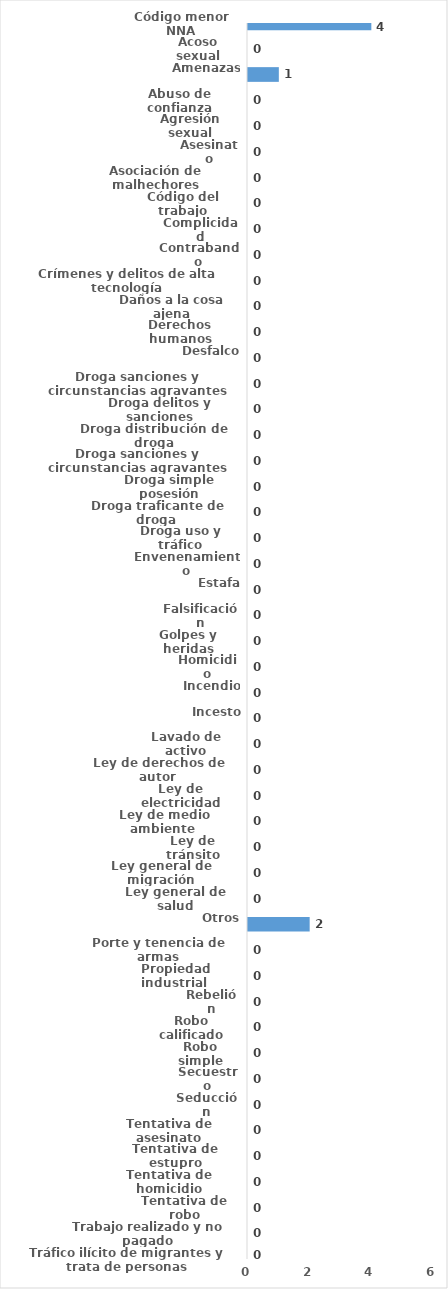
| Category | Series 0 |
|---|---|
| Código menor NNA | 4 |
| Acoso sexual | 0 |
| Amenazas | 1 |
| Abuso de confianza | 0 |
| Agresión sexual | 0 |
| Asesinato | 0 |
| Asociación de malhechores | 0 |
| Código del trabajo | 0 |
| Complicidad | 0 |
| Contrabando | 0 |
| Crímenes y delitos de alta tecnología | 0 |
| Daños a la cosa ajena | 0 |
| Derechos humanos | 0 |
| Desfalco | 0 |
| Droga sanciones y circunstancias agravantes | 0 |
| Droga delitos y sanciones | 0 |
| Droga distribución de droga | 0 |
| Droga sanciones y circunstancias agravantes | 0 |
| Droga simple posesión | 0 |
| Droga traficante de droga  | 0 |
| Droga uso y tráfico | 0 |
| Envenenamiento | 0 |
| Estafa | 0 |
| Falsificación | 0 |
| Golpes y heridas | 0 |
| Homicidio | 0 |
| Incendio | 0 |
| Incesto | 0 |
| Lavado de activo | 0 |
| Ley de derechos de autor  | 0 |
| Ley de electricidad | 0 |
| Ley de medio ambiente  | 0 |
| Ley de tránsito | 0 |
| Ley general de migración | 0 |
| Ley general de salud | 0 |
| Otros | 2 |
| Porte y tenencia de armas | 0 |
| Propiedad industrial  | 0 |
| Rebelión | 0 |
| Robo calificado | 0 |
| Robo simple | 0 |
| Secuestro | 0 |
| Seducción | 0 |
| Tentativa de asesinato | 0 |
| Tentativa de estupro | 0 |
| Tentativa de homicidio | 0 |
| Tentativa de robo | 0 |
| Trabajo realizado y no pagado | 0 |
| Tráfico ilícito de migrantes y trata de personas | 0 |